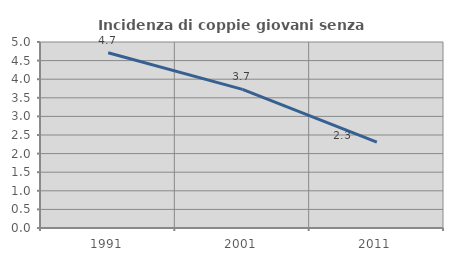
| Category | Incidenza di coppie giovani senza figli |
|---|---|
| 1991.0 | 4.711 |
| 2001.0 | 3.727 |
| 2011.0 | 2.31 |